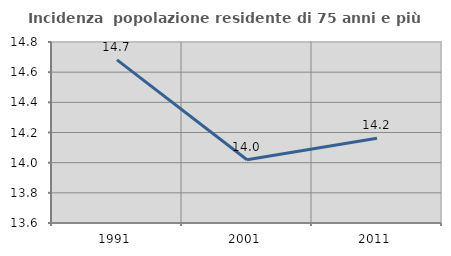
| Category | Incidenza  popolazione residente di 75 anni e più |
|---|---|
| 1991.0 | 14.682 |
| 2001.0 | 14.019 |
| 2011.0 | 14.162 |